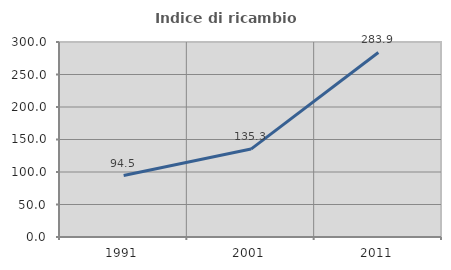
| Category | Indice di ricambio occupazionale  |
|---|---|
| 1991.0 | 94.508 |
| 2001.0 | 135.263 |
| 2011.0 | 283.945 |